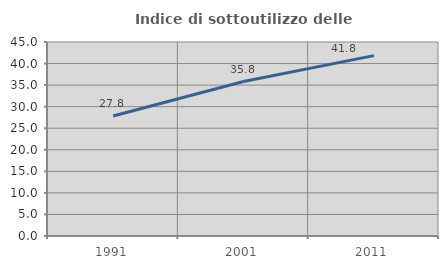
| Category | Indice di sottoutilizzo delle abitazioni  |
|---|---|
| 1991.0 | 27.827 |
| 2001.0 | 35.828 |
| 2011.0 | 41.844 |